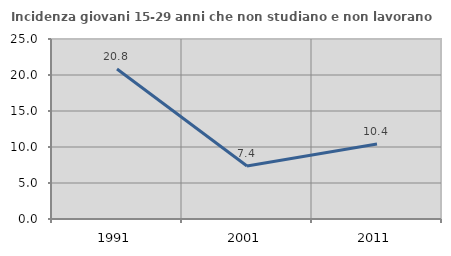
| Category | Incidenza giovani 15-29 anni che non studiano e non lavorano  |
|---|---|
| 1991.0 | 20.827 |
| 2001.0 | 7.368 |
| 2011.0 | 10.417 |